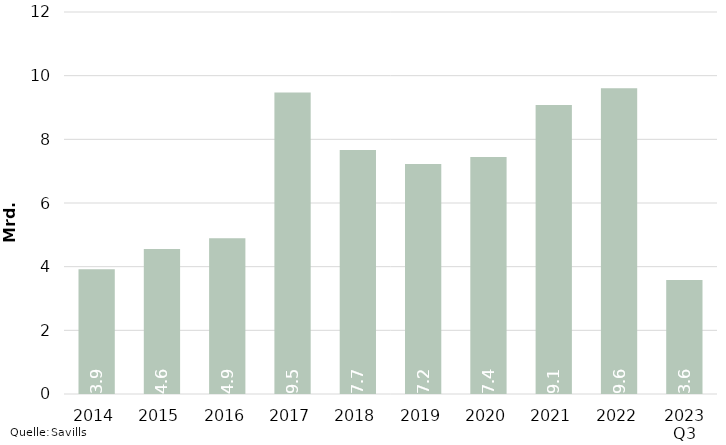
| Category | Series 1 |
|---|---|
| 2014 | 3920968980.31 |
| 2015 | 4557113724.92 |
| 2016 | 4890351002.13 |
| 2017 | 9470343512.7 |
| 2018 | 7666795490.35 |
| 2019 | 7226755920.45 |
| 2020 | 7446392351.54 |
| 2021 | 9077587684.96 |
| 2022 | 9608407449.94 |
| 2023 Q3 | 3583502618.94 |